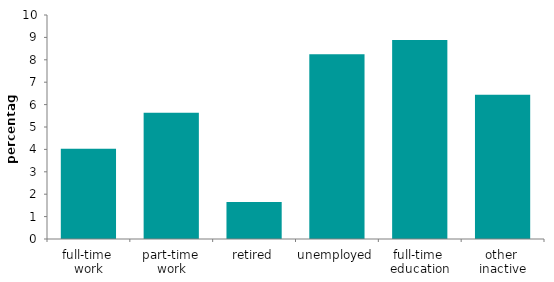
| Category | Series 0 |
|---|---|
| full-time 
work | 4.032 |
| part-time 
work | 5.638 |
| retired | 1.655 |
| unemployed | 8.248 |
| full-time 
education | 8.883 |
| other 
inactive | 6.437 |